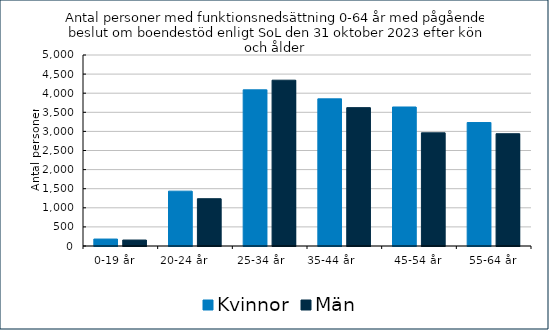
| Category | Kvinnor | Män  |
|---|---|---|
| 0-19 år    | 182 | 156 |
| 20-24 år       | 1436 | 1238 |
| 25-34 år      | 4088 | 4341 |
| 35-44 år        | 3852 | 3622 |
| 45-54 år | 3639 | 2963 |
| 55-64 år | 3232 | 2939 |